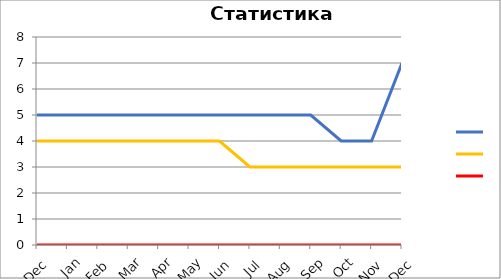
| Category | Series 1 | Series 0 | Series 2 |
|---|---|---|---|
| 0 | 5 | 4 | 0 |
| 1 | 5 | 4 | 0 |
| 2 | 5 | 4 | 0 |
| 3 | 5 | 4 | 0 |
| 4 | 5 | 4 | 0 |
| 5 | 5 | 4 | 0 |
| 6 | 5 | 4 | 0 |
| 7 | 5 | 3 | 0 |
| 8 | 5 | 3 | 0 |
| 9 | 5 | 3 | 0 |
| 10 | 4 | 3 | 0 |
| 11 | 4 | 3 | 0 |
| 12 | 7 | 3 | 0 |